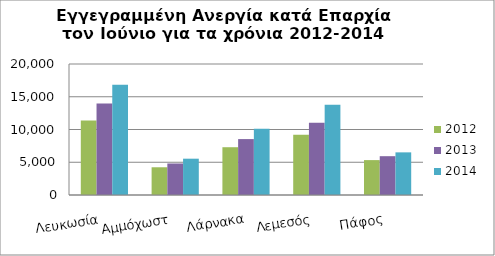
| Category | 2012 | 2013 | 2014 |
|---|---|---|---|
| Λευκωσία | 11386 | 13961 | 16835 |
| Αμμόχωστ | 4234 | 4813 | 5544 |
| Λάρνακα | 7295 | 8536 | 10114 |
| Λεμεσός | 9199 | 11044 | 13769 |
| Πάφος | 5328 | 5926 | 6510 |